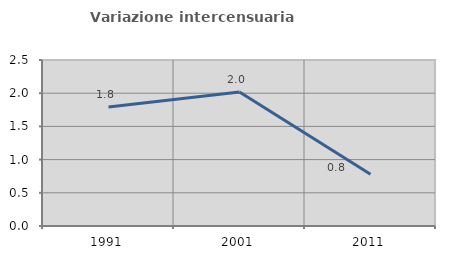
| Category | Variazione intercensuaria annua |
|---|---|
| 1991.0 | 1.793 |
| 2001.0 | 2.017 |
| 2011.0 | 0.778 |